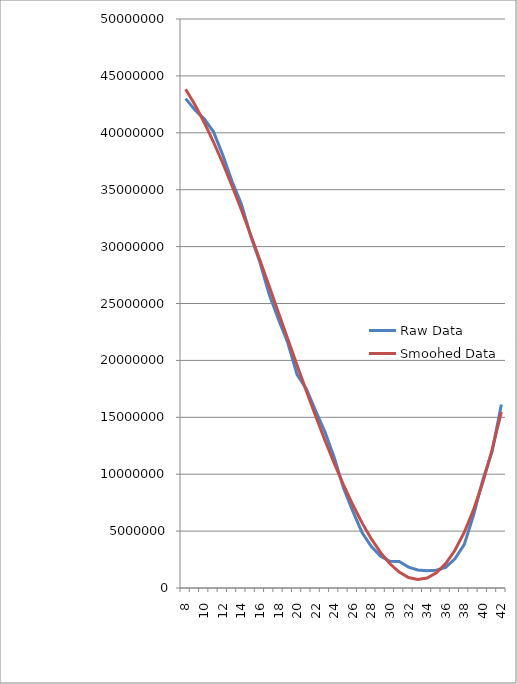
| Category | Raw Data | Smoohed Data |
|---|---|---|
| 8.0 | 43001000 | 43818465.07 |
| 9.0 | 42001600 | 42457604.56 |
| 10.0 | 41229300 | 40907824.89 |
| 11.0 | 40086400 | 39189832.48 |
| 12.0 | 38052000 | 37324333.75 |
| 13.0 | 35723500 | 35332035.12 |
| 14.0 | 33742400 | 33233643.01 |
| 15.0 | 30955500 | 31049863.84 |
| 16.0 | 28626600 | 28801404.03 |
| 17.0 | 25796400 | 26508970 |
| 18.0 | 23606700 | 24193268.17 |
| 19.0 | 21552600 | 21875004.96 |
| 20.0 | 18755100 | 19574886.79 |
| 21.0 | 17501500 | 17313620.08 |
| 22.0 | 15559600 | 15111911.25 |
| 23.0 | 13735500 | 12990466.72 |
| 24.0 | 11470700 | 10969992.91 |
| 25.0 | 8796190 | 9071196.24 |
| 26.0 | 6751690 | 7314783.13 |
| 27.0 | 4874840 | 5721460 |
| 28.0 | 3640590 | 4311933.27 |
| 29.0 | 2792070 | 3106909.36 |
| 30.0 | 2348840 | 2127094.69 |
| 31.0 | 2321560 | 1393195.68 |
| 32.0 | 1840270 | 925918.75 |
| 33.0 | 1586050 | 745970.32 |
| 34.0 | 1518710 | 874056.81 |
| 35.0 | 1568820 | 1330884.64 |
| 36.0 | 1810570 | 2137160.23 |
| 37.0 | 2563740 | 3313590 |
| 38.0 | 3805070 | 4880880.37 |
| 39.0 | 6395770 | 6859737.76 |
| 40.0 | 9506240 | 9270868.59 |
| 41.0 | 11982900 | 12134979.28 |
| 42.0 | 16127300 | 15472776.25 |